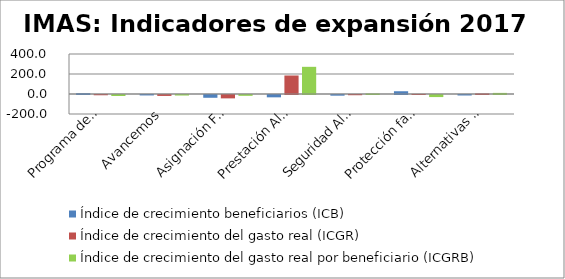
| Category | Índice de crecimiento beneficiarios (ICB)  | Índice de crecimiento del gasto real (ICGR)  | Índice de crecimiento del gasto real por beneficiario (ICGRB)  |
|---|---|---|---|
| Programa de Promoción y Protección Social | 8.434 | -2.623 | -10.197 |
| Avancemos | -4.414 | -9.383 | -5.198 |
| Asignación Familiar | -27.766 | -33.716 | -8.237 |
| Prestación Alimentaria | -23.333 | 185.019 | 271.764 |
| Seguridad Alimentaria | -6.741 | -2.259 | 4.806 |
| Protección familiar | 27.604 | 1.163 | -20.721 |
| Alternativas de Cuido | -4.929 | 5.525 | 10.996 |